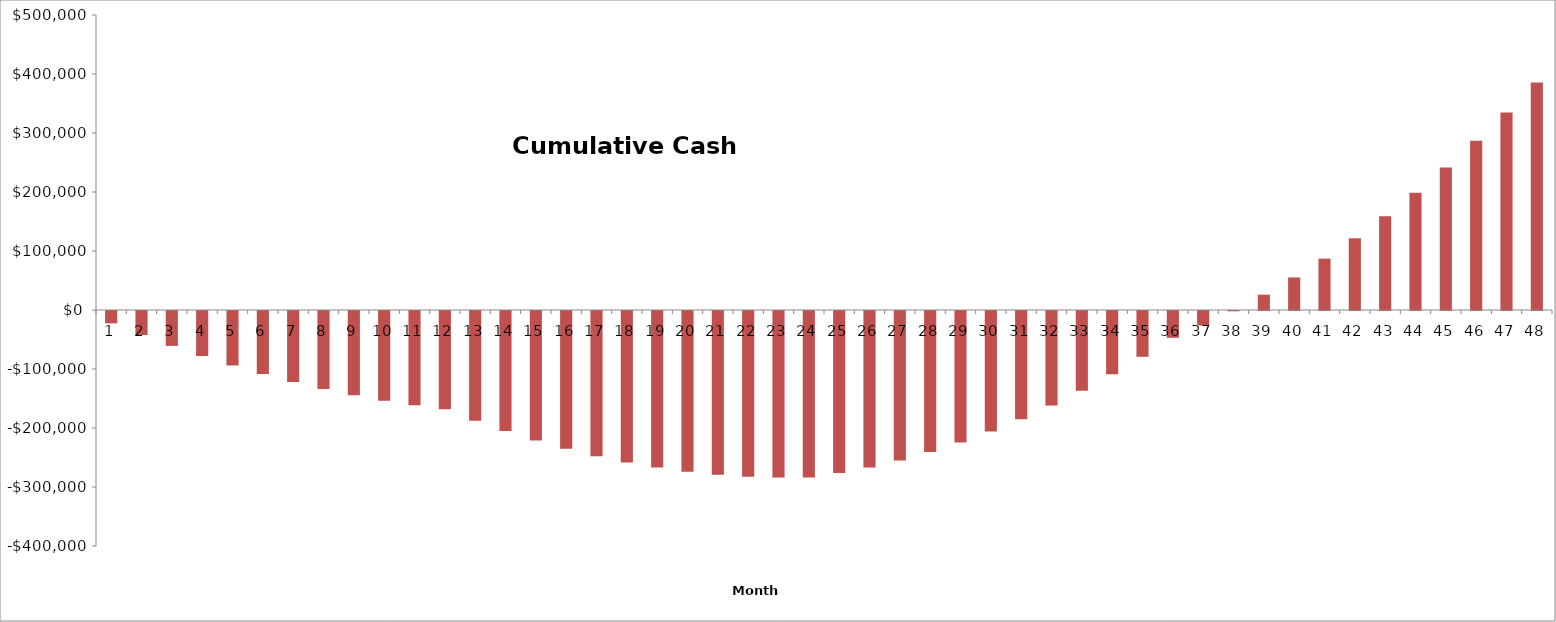
| Category | Monthly Cumulative Cash Flow |
|---|---|
| 0 | -20982.031 |
| 1 | -40699.74 |
| 2 | -59153.125 |
| 3 | -76342.187 |
| 4 | -92266.927 |
| 5 | -106927.344 |
| 6 | -120232.292 |
| 7 | -132181.771 |
| 8 | -142775.781 |
| 9 | -152014.323 |
| 10 | -159897.396 |
| 11 | -166425 |
| 12 | -185892.708 |
| 13 | -203583.507 |
| 14 | -219497.396 |
| 15 | -233634.375 |
| 16 | -245994.444 |
| 17 | -256577.604 |
| 18 | -265353.472 |
| 19 | -272322.049 |
| 20 | -277483.333 |
| 21 | -280837.326 |
| 22 | -282384.028 |
| 23 | -282123.438 |
| 24 | -274711.502 |
| 25 | -265070.833 |
| 26 | -253201.432 |
| 27 | -239103.299 |
| 28 | -222776.432 |
| 29 | -204220.833 |
| 30 | -183406.12 |
| 31 | -160332.292 |
| 32 | -134999.349 |
| 33 | -107407.292 |
| 34 | -77556.12 |
| 35 | -45445.833 |
| 36 | -24314.887 |
| 37 | -503.385 |
| 38 | 25988.672 |
| 39 | 55161.285 |
| 40 | 87014.453 |
| 41 | 121548.177 |
| 42 | 158792.839 |
| 43 | 198748.438 |
| 44 | 241414.974 |
| 45 | 286792.448 |
| 46 | 334880.859 |
| 47 | 385680.208 |